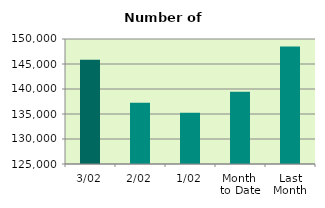
| Category | Series 0 |
|---|---|
| 3/02 | 145844 |
| 2/02 | 137242 |
| 1/02 | 135234 |
| Month 
to Date | 139440 |
| Last
Month | 148479.905 |